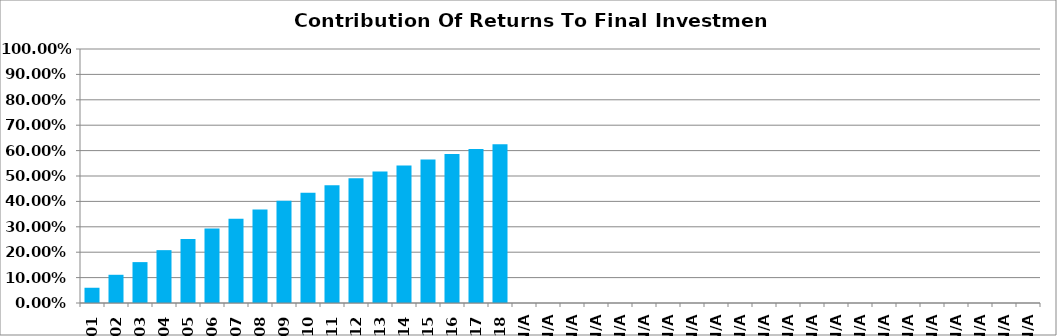
| Category | Series 0 |
|---|---|
| 2001-01-01 | 0.06 |
| 2002-01-01 | 0.111 |
| 2003-01-01 | 0.161 |
| 2004-01-01 | 0.208 |
| 2005-01-01 | 0.252 |
| 2006-01-01 | 0.294 |
| 2007-01-01 | 0.332 |
| 2008-01-01 | 0.368 |
| 2009-01-01 | 0.402 |
| 2010-01-01 | 0.434 |
| 2011-01-01 | 0.463 |
| 2012-01-01 | 0.491 |
| 2013-01-01 | 0.517 |
| 2014-01-01 | 0.542 |
| 2015-01-01 | 0.565 |
| 2016-01-01 | 0.586 |
| 2017-01-01 | 0.606 |
| 2018-01-01 | 0.625 |
| #N/A | 0 |
| #N/A | 0 |
| #N/A | 0 |
| #N/A | 0 |
| #N/A | 0 |
| #N/A | 0 |
| #N/A | 0 |
| #N/A | 0 |
| #N/A | 0 |
| #N/A | 0 |
| #N/A | 0 |
| #N/A | 0 |
| #N/A | 0 |
| #N/A | 0 |
| #N/A | 0 |
| #N/A | 0 |
| #N/A | 0 |
| #N/A | 0 |
| #N/A | 0 |
| #N/A | 0 |
| #N/A | 0 |
| #N/A | 0 |